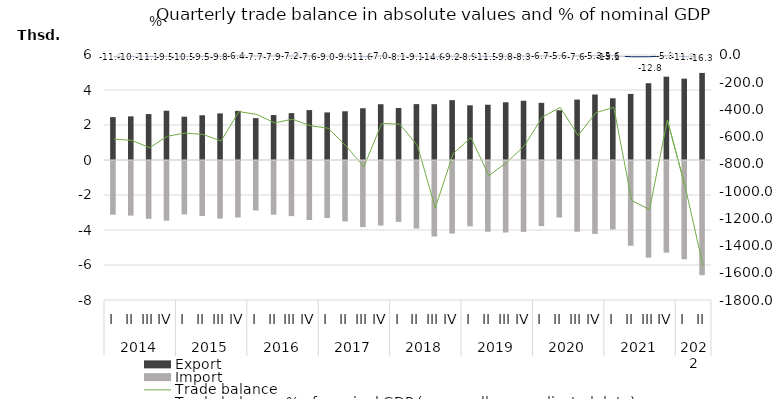
| Category | Export | Import |
|---|---|---|
| 0 | 2450.7 | -3068.8 |
| 1 | 2493.4 | -3120.5 |
| 2 | 2625.5 | -3306.5 |
| 3 | 2816.7 | -3413.2 |
| 4 | 2476.5 | -3050.1 |
| 5 | 2555.2 | -3139.2 |
| 6 | 2663.4 | -3295.5 |
| 7 | 2809.5 | -3225.4 |
| 8 | 2391.5 | -2828.1 |
| 9 | 2569.5 | -3068 |
| 10 | 2678.2 | -3149.9 |
| 11 | 2850.8 | -3370.5 |
| 12 | 2719.6 | -3257.4 |
| 13 | 2783.8 | -3452 |
| 14 | 2956.9 | -3777.4 |
| 15 | 3187 | -3690 |
| 16 | 2969.9 | -3477.4 |
| 17 | 3193.3 | -3857.4 |
| 18 | 3189.7 | -4313.9 |
| 19 | 3420.5 | -4144.2 |
| 20 | 3123.6 | -3730.2 |
| 21 | 3158.2 | -4044.8 |
| 22 | 3298.5 | -4087.5 |
| 23 | 3385.3 | -4051.1 |
| 24 | 3266.4 | -3720.9 |
| 25 | 2842.7 | -3228.3 |
| 26 | 3452.8 | -4043.7 |
| 27 | 3742.7 | -4166.6 |
| 28 | 3526.2 | -3910.7 |
| 29 | 3776 | -4844.9 |
| 30 | 4388.7 | -5523.8 |
| 31 | 4761.5 | -5239.5 |
| 32 | 4648.4 | -5616.8 |
| 33 | 4975.5 | -6525.2 |